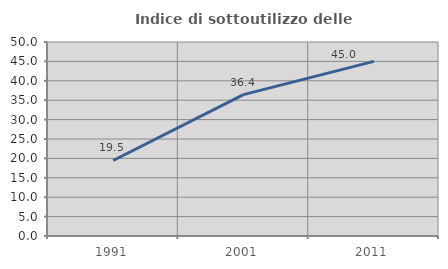
| Category | Indice di sottoutilizzo delle abitazioni  |
|---|---|
| 1991.0 | 19.463 |
| 2001.0 | 36.438 |
| 2011.0 | 45 |